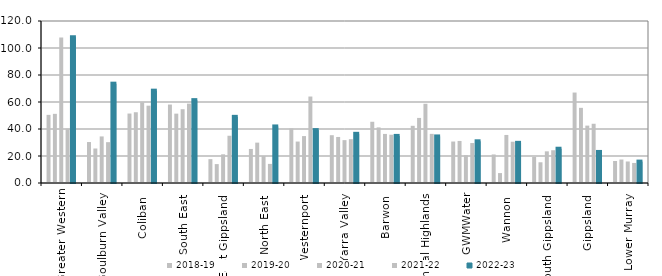
| Category | 2018-19 | 2019-20 | 2020-21 | 2021-22 | 2022-23 |
|---|---|---|---|---|---|
| Greater Western | 50.474 | 51.225 | 107.698 | 40.291 | 107.889 |
| Goulburn Valley  | 30.345 | 25.554 | 34.5 | 30.247 | 73.577 |
| Coliban  | 51.449 | 52.411 | 59.75 | 57.27 | 68.397 |
| South East  | 58.111 | 51.381 | 54.66 | 58.8 | 61.382 |
| East Gippsland  | 17.667 | 14 | 21.25 | 35 | 49 |
| North East  | 25.222 | 29.9 | 20 | 14.154 | 41.889 |
| Westernport  | 40.431 | 30.692 | 34.75 | 64.057 | 39.182 |
| Yarra Valley  | 35.404 | 34.101 | 31.751 | 32.463 | 36.429 |
| Barwon  | 45.361 | 41.185 | 36.35 | 35.758 | 34.884 |
| Central Highlands  | 42.37 | 48.203 | 58.673 | 36.397 | 34.492 |
| GWMWater | 30.717 | 31.143 | 20.605 | 29.6 | 30.889 |
| Wannon  | 21.149 | 7.35 | 35.586 | 30.583 | 29.742 |
| South Gippsland  | 19.286 | 15.353 | 23.45 | 24.267 | 25.383 |
| Gippsland  | 67 | 55.667 | 42.5 | 43.875 | 23 |
| Lower Murray  | 16.318 | 17.391 | 15.938 | 14.847 | 15.85 |